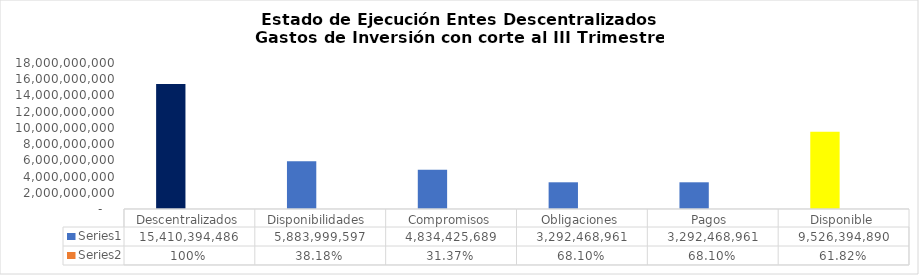
| Category | Series 0 | Series 1 |
|---|---|---|
| Descentralizados | 15410394486.11 | 1 |
| Disponibilidades  | 5883999596.504 | 0.382 |
| Compromisos | 4834425689.212 | 0.314 |
| Obligaciones | 3292468960.606 | 0.681 |
| Pagos  | 3292468960.606 | 0.681 |
| Disponible | 9526394889.606 | 0.618 |